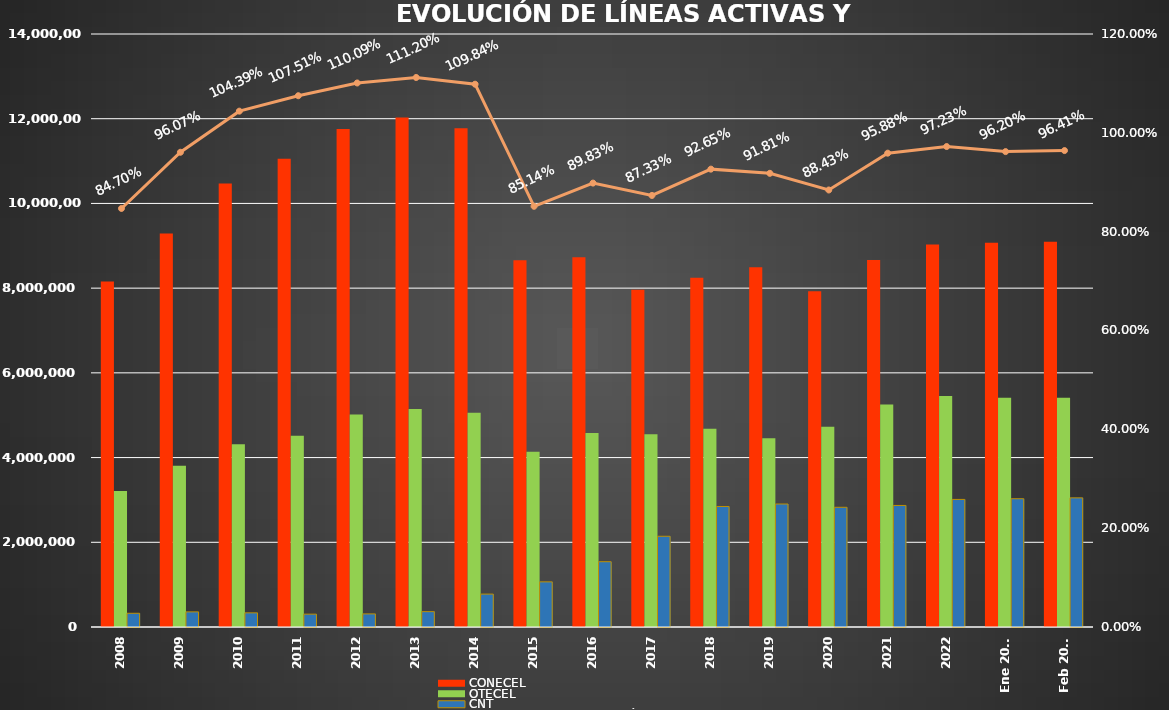
| Category | CONECEL | OTECEL | CNT |
|---|---|---|---|
| 2008 | 8156359 | 3211922 | 323967 |
| 2009 | 9291268 | 3806432 | 356900 |
| 2010 | 10470502 | 4314599 | 333730 |
| 2011 | 11057316 | 4513874 | 303368 |
| 2012 | 11757906 | 5019686 | 309271 |
| 2013 | 12030886 | 5148308 | 362560 |
| 2014 | 11772020 | 5055645 | 776892 |
| 2015 | 8658619 | 4134698 | 1065703 |
| 2016 | 8726823 | 4580092 | 1541219 |
| 2017 | 7960263 | 4549024 | 2142117 |
| 2018 | 8248050 | 4679646 | 2845142 |
| 2019 | 8493054 | 4456356 | 2903690 |
| 2020 | 7929253 | 4729725 | 2826388 |
| 2021 | 8665715 | 5254468 | 2869417 |
| 2022 | 9027737 | 5451115 | 3011899 |
| Ene 2023 | 9073421 | 5411860 | 3028254 |
| Feb 2023 | 9092490 | 5410682 | 3048837 |